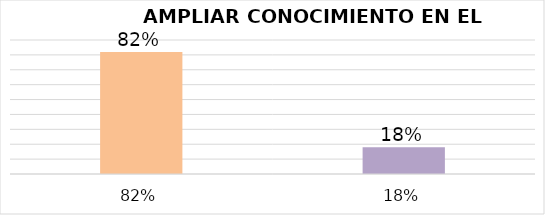
| Category | Series 4 |
|---|---|
| 0.82 | 0.82 |
| 0.18 | 0.18 |